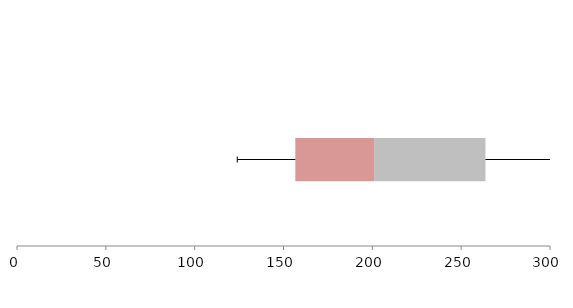
| Category | Series 1 | Series 2 | Series 3 |
|---|---|---|---|
| 0 | 156.655 | 44.333 | 62.668 |